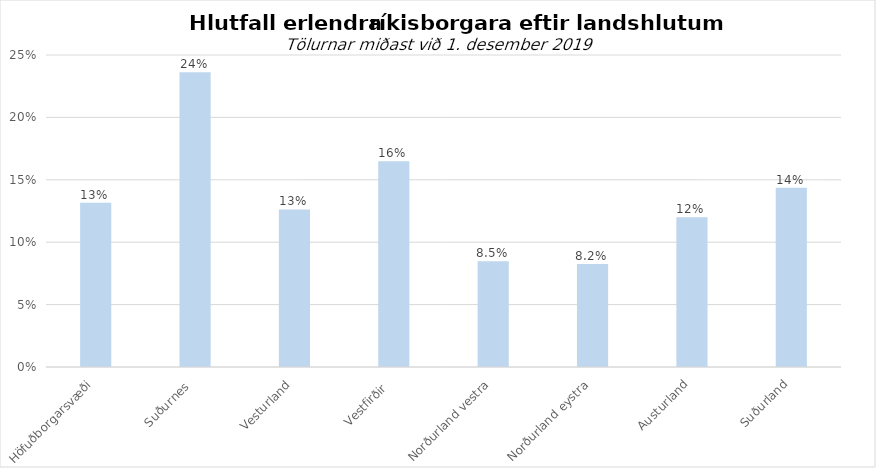
| Category | Series 0 |
|---|---|
| Höfuðborgarsvæði | 0.132 |
| Suðurnes  | 0.236 |
| Vesturland | 0.126 |
| Vestfirðir  | 0.165 |
| Norðurland vestra | 0.085 |
| Norðurland eystra | 0.082 |
| Austurland | 0.12 |
| Suðurland | 0.144 |